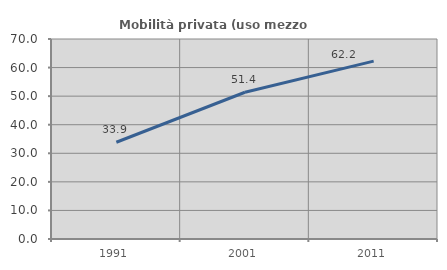
| Category | Mobilità privata (uso mezzo privato) |
|---|---|
| 1991.0 | 33.863 |
| 2001.0 | 51.363 |
| 2011.0 | 62.249 |